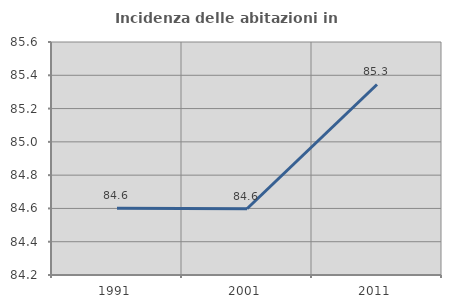
| Category | Incidenza delle abitazioni in proprietà  |
|---|---|
| 1991.0 | 84.601 |
| 2001.0 | 84.598 |
| 2011.0 | 85.345 |